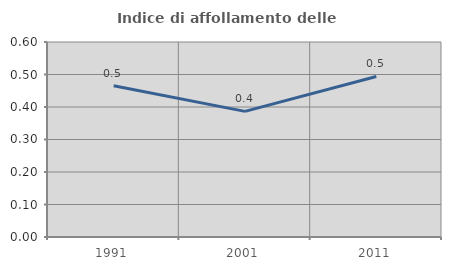
| Category | Indice di affollamento delle abitazioni  |
|---|---|
| 1991.0 | 0.465 |
| 2001.0 | 0.387 |
| 2011.0 | 0.494 |